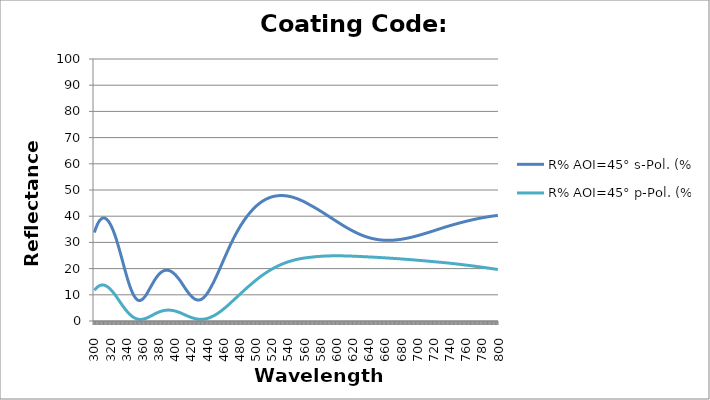
| Category | R% AOI=45° s-Pol. (%) | R% AOI=45° p-Pol. (%) |
|---|---|---|
| 300.0 | 33.782 | 11.718 |
| 301.0 | 34.743 | 12.104 |
| 302.0 | 35.607 | 12.45 |
| 303.0 | 36.377 | 12.756 |
| 304.0 | 37.053 | 13.021 |
| 305.0 | 37.637 | 13.246 |
| 306.0 | 38.132 | 13.429 |
| 307.0 | 38.538 | 13.571 |
| 308.0 | 38.86 | 13.672 |
| 309.0 | 39.097 | 13.734 |
| 310.0 | 39.253 | 13.756 |
| 311.0 | 39.33 | 13.739 |
| 312.0 | 39.328 | 13.684 |
| 313.0 | 39.251 | 13.594 |
| 314.0 | 39.1 | 13.468 |
| 315.0 | 38.878 | 13.308 |
| 316.0 | 38.584 | 13.115 |
| 317.0 | 38.222 | 12.892 |
| 318.0 | 37.794 | 12.639 |
| 319.0 | 37.3 | 12.359 |
| 320.0 | 36.743 | 12.053 |
| 321.0 | 36.124 | 11.723 |
| 322.0 | 35.445 | 11.371 |
| 323.0 | 34.71 | 10.999 |
| 324.0 | 33.921 | 10.61 |
| 325.0 | 33.08 | 10.205 |
| 326.0 | 32.19 | 9.787 |
| 327.0 | 31.256 | 9.358 |
| 328.0 | 30.279 | 8.92 |
| 329.0 | 29.265 | 8.475 |
| 330.0 | 28.217 | 8.026 |
| 331.0 | 27.139 | 7.574 |
| 332.0 | 26.038 | 7.123 |
| 333.0 | 24.918 | 6.674 |
| 334.0 | 23.785 | 6.23 |
| 335.0 | 22.644 | 5.792 |
| 336.0 | 21.503 | 5.363 |
| 337.0 | 20.368 | 4.945 |
| 338.0 | 19.246 | 4.538 |
| 339.0 | 18.144 | 4.146 |
| 340.0 | 17.068 | 3.77 |
| 341.0 | 16.026 | 3.411 |
| 342.0 | 15.025 | 3.07 |
| 343.0 | 14.07 | 2.749 |
| 344.0 | 13.17 | 2.449 |
| 345.0 | 12.328 | 2.171 |
| 346.0 | 11.551 | 1.915 |
| 347.0 | 10.843 | 1.682 |
| 348.0 | 10.208 | 1.472 |
| 349.0 | 9.649 | 1.286 |
| 350.0 | 9.169 | 1.124 |
| 351.0 | 8.722 | 0.976 |
| 352.0 | 8.354 | 0.85 |
| 353.0 | 8.08 | 0.752 |
| 354.0 | 7.897 | 0.678 |
| 355.0 | 7.801 | 0.628 |
| 356.0 | 7.789 | 0.602 |
| 357.0 | 7.855 | 0.597 |
| 358.0 | 7.993 | 0.612 |
| 359.0 | 8.196 | 0.646 |
| 360.0 | 8.456 | 0.697 |
| 361.0 | 8.768 | 0.763 |
| 362.0 | 9.122 | 0.843 |
| 363.0 | 9.512 | 0.935 |
| 364.0 | 9.929 | 1.036 |
| 365.0 | 10.442 | 1.165 |
| 366.0 | 10.996 | 1.309 |
| 367.0 | 11.559 | 1.459 |
| 368.0 | 12.124 | 1.614 |
| 369.0 | 12.68 | 1.772 |
| 370.0 | 13.222 | 1.928 |
| 371.0 | 13.742 | 2.083 |
| 372.0 | 14.291 | 2.249 |
| 373.0 | 14.829 | 2.414 |
| 374.0 | 15.346 | 2.578 |
| 375.0 | 15.84 | 2.737 |
| 376.0 | 16.307 | 2.892 |
| 377.0 | 16.745 | 3.04 |
| 378.0 | 17.153 | 3.182 |
| 379.0 | 17.53 | 3.316 |
| 380.0 | 17.873 | 3.442 |
| 381.0 | 18.183 | 3.558 |
| 382.0 | 18.459 | 3.666 |
| 383.0 | 18.699 | 3.763 |
| 384.0 | 18.904 | 3.85 |
| 385.0 | 19.074 | 3.927 |
| 386.0 | 19.212 | 3.994 |
| 387.0 | 19.315 | 4.05 |
| 388.0 | 19.382 | 4.095 |
| 389.0 | 19.414 | 4.129 |
| 390.0 | 19.411 | 4.151 |
| 391.0 | 19.373 | 4.162 |
| 392.0 | 19.301 | 4.161 |
| 393.0 | 19.197 | 4.149 |
| 394.0 | 19.06 | 4.127 |
| 395.0 | 18.894 | 4.094 |
| 396.0 | 18.697 | 4.051 |
| 397.0 | 18.472 | 3.998 |
| 398.0 | 18.221 | 3.936 |
| 399.0 | 17.944 | 3.865 |
| 400.0 | 17.643 | 3.786 |
| 401.0 | 17.318 | 3.698 |
| 402.0 | 16.974 | 3.603 |
| 403.0 | 16.61 | 3.502 |
| 404.0 | 16.23 | 3.395 |
| 405.0 | 15.835 | 3.282 |
| 406.0 | 15.427 | 3.165 |
| 407.0 | 14.995 | 3.039 |
| 408.0 | 14.508 | 2.896 |
| 409.0 | 14.019 | 2.752 |
| 410.0 | 13.551 | 2.614 |
| 411.0 | 13.084 | 2.475 |
| 412.0 | 12.623 | 2.336 |
| 413.0 | 12.168 | 2.199 |
| 414.0 | 11.724 | 2.064 |
| 415.0 | 11.293 | 1.931 |
| 416.0 | 10.877 | 1.801 |
| 417.0 | 10.48 | 1.676 |
| 418.0 | 10.103 | 1.554 |
| 419.0 | 9.75 | 1.438 |
| 420.0 | 9.423 | 1.328 |
| 421.0 | 9.124 | 1.223 |
| 422.0 | 8.855 | 1.126 |
| 423.0 | 8.62 | 1.036 |
| 424.0 | 8.419 | 0.954 |
| 425.0 | 8.255 | 0.88 |
| 426.0 | 8.129 | 0.816 |
| 427.0 | 8.042 | 0.76 |
| 428.0 | 7.996 | 0.714 |
| 429.0 | 7.992 | 0.678 |
| 430.0 | 8.03 | 0.653 |
| 431.0 | 8.112 | 0.638 |
| 432.0 | 8.236 | 0.634 |
| 433.0 | 8.403 | 0.641 |
| 434.0 | 8.613 | 0.66 |
| 435.0 | 8.865 | 0.689 |
| 436.0 | 9.159 | 0.731 |
| 437.0 | 9.493 | 0.783 |
| 438.0 | 9.867 | 0.848 |
| 439.0 | 10.276 | 0.924 |
| 440.0 | 10.72 | 1.011 |
| 441.0 | 11.199 | 1.109 |
| 442.0 | 11.71 | 1.218 |
| 443.0 | 12.252 | 1.339 |
| 444.0 | 12.822 | 1.471 |
| 445.0 | 13.391 | 1.607 |
| 446.0 | 13.972 | 1.751 |
| 447.0 | 14.573 | 1.904 |
| 448.0 | 15.191 | 2.065 |
| 449.0 | 15.826 | 2.236 |
| 450.0 | 16.476 | 2.415 |
| 451.0 | 17.138 | 2.603 |
| 452.0 | 17.812 | 2.798 |
| 453.0 | 18.496 | 3.002 |
| 454.0 | 19.186 | 3.213 |
| 455.0 | 19.884 | 3.431 |
| 456.0 | 20.585 | 3.656 |
| 457.0 | 21.29 | 3.887 |
| 458.0 | 21.996 | 4.125 |
| 459.0 | 22.703 | 4.368 |
| 460.0 | 23.409 | 4.618 |
| 461.0 | 24.113 | 4.872 |
| 462.0 | 24.814 | 5.131 |
| 463.0 | 25.51 | 5.395 |
| 464.0 | 26.201 | 5.662 |
| 465.0 | 26.886 | 5.934 |
| 466.0 | 27.564 | 6.209 |
| 467.0 | 28.235 | 6.488 |
| 468.0 | 28.896 | 6.769 |
| 469.0 | 29.549 | 7.053 |
| 470.0 | 30.192 | 7.339 |
| 471.0 | 30.825 | 7.626 |
| 472.0 | 31.447 | 7.916 |
| 473.0 | 32.056 | 8.205 |
| 474.0 | 32.643 | 8.49 |
| 475.0 | 33.218 | 8.776 |
| 476.0 | 33.783 | 9.063 |
| 477.0 | 34.336 | 9.35 |
| 478.0 | 34.877 | 9.636 |
| 479.0 | 35.407 | 9.923 |
| 480.0 | 35.924 | 10.21 |
| 481.0 | 36.43 | 10.495 |
| 482.0 | 36.923 | 10.78 |
| 483.0 | 37.404 | 11.064 |
| 484.0 | 37.874 | 11.347 |
| 485.0 | 38.33 | 11.628 |
| 486.0 | 38.775 | 11.908 |
| 487.0 | 39.208 | 12.186 |
| 488.0 | 39.628 | 12.462 |
| 489.0 | 40.036 | 12.736 |
| 490.0 | 40.433 | 13.008 |
| 491.0 | 40.817 | 13.278 |
| 492.0 | 41.19 | 13.545 |
| 493.0 | 41.55 | 13.81 |
| 494.0 | 41.9 | 14.072 |
| 495.0 | 42.242 | 14.335 |
| 496.0 | 42.578 | 14.599 |
| 497.0 | 42.902 | 14.859 |
| 498.0 | 43.215 | 15.117 |
| 499.0 | 43.515 | 15.371 |
| 500.0 | 43.805 | 15.622 |
| 501.0 | 44.082 | 15.87 |
| 502.0 | 44.349 | 16.114 |
| 503.0 | 44.605 | 16.355 |
| 504.0 | 44.85 | 16.592 |
| 505.0 | 45.084 | 16.825 |
| 506.0 | 45.308 | 17.055 |
| 507.0 | 45.521 | 17.281 |
| 508.0 | 45.724 | 17.503 |
| 509.0 | 45.917 | 17.722 |
| 510.0 | 46.1 | 17.936 |
| 511.0 | 46.273 | 18.147 |
| 512.0 | 46.436 | 18.354 |
| 513.0 | 46.59 | 18.558 |
| 514.0 | 46.735 | 18.757 |
| 515.0 | 46.871 | 18.953 |
| 516.0 | 46.997 | 19.144 |
| 517.0 | 47.114 | 19.332 |
| 518.0 | 47.222 | 19.516 |
| 519.0 | 47.322 | 19.696 |
| 520.0 | 47.413 | 19.871 |
| 521.0 | 47.495 | 20.044 |
| 522.0 | 47.569 | 20.212 |
| 523.0 | 47.635 | 20.376 |
| 524.0 | 47.694 | 20.537 |
| 525.0 | 47.744 | 20.693 |
| 526.0 | 47.786 | 20.846 |
| 527.0 | 47.821 | 20.996 |
| 528.0 | 47.848 | 21.141 |
| 529.0 | 47.868 | 21.283 |
| 530.0 | 47.88 | 21.421 |
| 531.0 | 47.886 | 21.556 |
| 532.0 | 47.884 | 21.687 |
| 533.0 | 47.875 | 21.814 |
| 534.0 | 47.86 | 21.938 |
| 535.0 | 47.838 | 22.059 |
| 536.0 | 47.809 | 22.176 |
| 537.0 | 47.774 | 22.289 |
| 538.0 | 47.732 | 22.4 |
| 539.0 | 47.685 | 22.506 |
| 540.0 | 47.631 | 22.61 |
| 541.0 | 47.571 | 22.711 |
| 542.0 | 47.505 | 22.808 |
| 543.0 | 47.433 | 22.902 |
| 544.0 | 47.356 | 22.993 |
| 545.0 | 47.272 | 23.081 |
| 546.0 | 47.184 | 23.166 |
| 547.0 | 47.09 | 23.248 |
| 548.0 | 46.99 | 23.327 |
| 549.0 | 46.886 | 23.404 |
| 550.0 | 46.776 | 23.477 |
| 551.0 | 46.661 | 23.547 |
| 552.0 | 46.541 | 23.615 |
| 553.0 | 46.416 | 23.68 |
| 554.0 | 46.286 | 23.742 |
| 555.0 | 46.152 | 23.801 |
| 556.0 | 46.013 | 23.856 |
| 557.0 | 45.87 | 23.909 |
| 558.0 | 45.723 | 23.96 |
| 559.0 | 45.571 | 24.008 |
| 560.0 | 45.416 | 24.053 |
| 561.0 | 45.256 | 24.097 |
| 562.0 | 45.093 | 24.138 |
| 563.0 | 44.926 | 24.177 |
| 564.0 | 44.755 | 24.213 |
| 565.0 | 44.58 | 24.248 |
| 566.0 | 44.402 | 24.28 |
| 567.0 | 44.229 | 24.315 |
| 568.0 | 44.063 | 24.354 |
| 569.0 | 43.895 | 24.391 |
| 570.0 | 43.724 | 24.427 |
| 571.0 | 43.551 | 24.461 |
| 572.0 | 43.375 | 24.494 |
| 573.0 | 43.197 | 24.524 |
| 574.0 | 43.017 | 24.554 |
| 575.0 | 42.835 | 24.582 |
| 576.0 | 42.651 | 24.608 |
| 577.0 | 42.465 | 24.633 |
| 578.0 | 42.277 | 24.657 |
| 579.0 | 42.088 | 24.679 |
| 580.0 | 41.897 | 24.7 |
| 581.0 | 41.705 | 24.72 |
| 582.0 | 41.511 | 24.738 |
| 583.0 | 41.316 | 24.755 |
| 584.0 | 41.12 | 24.771 |
| 585.0 | 40.924 | 24.785 |
| 586.0 | 40.726 | 24.799 |
| 587.0 | 40.528 | 24.811 |
| 588.0 | 40.329 | 24.823 |
| 589.0 | 40.13 | 24.833 |
| 590.0 | 39.93 | 24.842 |
| 591.0 | 39.73 | 24.85 |
| 592.0 | 39.529 | 24.857 |
| 593.0 | 39.329 | 24.864 |
| 594.0 | 39.129 | 24.869 |
| 595.0 | 38.929 | 24.873 |
| 596.0 | 38.729 | 24.876 |
| 597.0 | 38.53 | 24.879 |
| 598.0 | 38.331 | 24.881 |
| 599.0 | 38.132 | 24.882 |
| 600.0 | 37.935 | 24.882 |
| 601.0 | 37.738 | 24.881 |
| 602.0 | 37.542 | 24.88 |
| 603.0 | 37.347 | 24.877 |
| 604.0 | 37.154 | 24.874 |
| 605.0 | 36.962 | 24.871 |
| 606.0 | 36.771 | 24.866 |
| 607.0 | 36.581 | 24.861 |
| 608.0 | 36.393 | 24.856 |
| 609.0 | 36.207 | 24.849 |
| 610.0 | 36.023 | 24.842 |
| 611.0 | 35.841 | 24.835 |
| 612.0 | 35.66 | 24.827 |
| 613.0 | 35.482 | 24.819 |
| 614.0 | 35.306 | 24.81 |
| 615.0 | 35.133 | 24.8 |
| 616.0 | 34.961 | 24.79 |
| 617.0 | 34.793 | 24.779 |
| 618.0 | 34.626 | 24.768 |
| 619.0 | 34.463 | 24.757 |
| 620.0 | 34.302 | 24.745 |
| 621.0 | 34.144 | 24.732 |
| 622.0 | 33.989 | 24.72 |
| 623.0 | 33.837 | 24.706 |
| 624.0 | 33.688 | 24.693 |
| 625.0 | 33.542 | 24.679 |
| 626.0 | 33.399 | 24.665 |
| 627.0 | 33.259 | 24.65 |
| 628.0 | 33.123 | 24.635 |
| 629.0 | 32.99 | 24.62 |
| 630.0 | 32.86 | 24.604 |
| 631.0 | 32.734 | 24.588 |
| 632.0 | 32.612 | 24.572 |
| 633.0 | 32.494 | 24.556 |
| 634.0 | 32.381 | 24.541 |
| 635.0 | 32.273 | 24.526 |
| 636.0 | 32.169 | 24.512 |
| 637.0 | 32.068 | 24.496 |
| 638.0 | 31.972 | 24.481 |
| 639.0 | 31.879 | 24.466 |
| 640.0 | 31.79 | 24.45 |
| 641.0 | 31.704 | 24.434 |
| 642.0 | 31.623 | 24.418 |
| 643.0 | 31.545 | 24.402 |
| 644.0 | 31.472 | 24.385 |
| 645.0 | 31.402 | 24.368 |
| 646.0 | 31.336 | 24.352 |
| 647.0 | 31.274 | 24.334 |
| 648.0 | 31.215 | 24.317 |
| 649.0 | 31.161 | 24.3 |
| 650.0 | 31.11 | 24.282 |
| 651.0 | 31.063 | 24.264 |
| 652.0 | 31.02 | 24.246 |
| 653.0 | 30.98 | 24.228 |
| 654.0 | 30.945 | 24.209 |
| 655.0 | 30.913 | 24.19 |
| 656.0 | 30.885 | 24.172 |
| 657.0 | 30.86 | 24.153 |
| 658.0 | 30.839 | 24.133 |
| 659.0 | 30.822 | 24.114 |
| 660.0 | 30.808 | 24.095 |
| 661.0 | 30.798 | 24.075 |
| 662.0 | 30.792 | 24.055 |
| 663.0 | 30.788 | 24.035 |
| 664.0 | 30.788 | 24.015 |
| 665.0 | 30.792 | 23.995 |
| 666.0 | 30.799 | 23.975 |
| 667.0 | 30.809 | 23.954 |
| 668.0 | 30.823 | 23.934 |
| 669.0 | 30.839 | 23.913 |
| 670.0 | 30.859 | 23.892 |
| 671.0 | 30.882 | 23.871 |
| 672.0 | 30.908 | 23.849 |
| 673.0 | 30.936 | 23.828 |
| 674.0 | 30.968 | 23.806 |
| 675.0 | 31.002 | 23.785 |
| 676.0 | 31.04 | 23.763 |
| 677.0 | 31.079 | 23.741 |
| 678.0 | 31.122 | 23.719 |
| 679.0 | 31.167 | 23.696 |
| 680.0 | 31.215 | 23.674 |
| 681.0 | 31.265 | 23.651 |
| 682.0 | 31.317 | 23.628 |
| 683.0 | 31.372 | 23.606 |
| 684.0 | 31.429 | 23.582 |
| 685.0 | 31.488 | 23.559 |
| 686.0 | 31.55 | 23.536 |
| 687.0 | 31.613 | 23.512 |
| 688.0 | 31.679 | 23.488 |
| 689.0 | 31.746 | 23.464 |
| 690.0 | 31.815 | 23.44 |
| 691.0 | 31.886 | 23.416 |
| 692.0 | 31.959 | 23.392 |
| 693.0 | 32.034 | 23.367 |
| 694.0 | 32.11 | 23.342 |
| 695.0 | 32.187 | 23.318 |
| 696.0 | 32.266 | 23.292 |
| 697.0 | 32.347 | 23.267 |
| 698.0 | 32.429 | 23.242 |
| 699.0 | 32.512 | 23.216 |
| 700.0 | 32.596 | 23.19 |
| 701.0 | 32.682 | 23.164 |
| 702.0 | 32.768 | 23.138 |
| 703.0 | 32.856 | 23.112 |
| 704.0 | 32.944 | 23.085 |
| 705.0 | 33.034 | 23.058 |
| 706.0 | 33.124 | 23.031 |
| 707.0 | 33.216 | 23.004 |
| 708.0 | 33.308 | 22.976 |
| 709.0 | 33.4 | 22.949 |
| 710.0 | 33.494 | 22.921 |
| 711.0 | 33.588 | 22.893 |
| 712.0 | 33.682 | 22.865 |
| 713.0 | 33.777 | 22.836 |
| 714.0 | 33.873 | 22.808 |
| 715.0 | 33.969 | 22.779 |
| 716.0 | 34.065 | 22.75 |
| 717.0 | 34.162 | 22.721 |
| 718.0 | 34.258 | 22.691 |
| 719.0 | 34.356 | 22.662 |
| 720.0 | 34.456 | 22.634 |
| 721.0 | 34.556 | 22.608 |
| 722.0 | 34.658 | 22.581 |
| 723.0 | 34.759 | 22.554 |
| 724.0 | 34.86 | 22.527 |
| 725.0 | 34.961 | 22.499 |
| 726.0 | 35.062 | 22.472 |
| 727.0 | 35.162 | 22.444 |
| 728.0 | 35.263 | 22.416 |
| 729.0 | 35.363 | 22.387 |
| 730.0 | 35.464 | 22.359 |
| 731.0 | 35.563 | 22.33 |
| 732.0 | 35.663 | 22.301 |
| 733.0 | 35.762 | 22.271 |
| 734.0 | 35.859 | 22.241 |
| 735.0 | 35.951 | 22.209 |
| 736.0 | 36.043 | 22.176 |
| 737.0 | 36.134 | 22.143 |
| 738.0 | 36.225 | 22.11 |
| 739.0 | 36.315 | 22.077 |
| 740.0 | 36.405 | 22.044 |
| 741.0 | 36.494 | 22.01 |
| 742.0 | 36.583 | 21.976 |
| 743.0 | 36.671 | 21.942 |
| 744.0 | 36.759 | 21.907 |
| 745.0 | 36.846 | 21.873 |
| 746.0 | 36.932 | 21.838 |
| 747.0 | 37.018 | 21.803 |
| 748.0 | 37.104 | 21.767 |
| 749.0 | 37.188 | 21.732 |
| 750.0 | 37.272 | 21.696 |
| 751.0 | 37.356 | 21.66 |
| 752.0 | 37.438 | 21.624 |
| 753.0 | 37.52 | 21.587 |
| 754.0 | 37.601 | 21.551 |
| 755.0 | 37.681 | 21.514 |
| 756.0 | 37.76 | 21.476 |
| 757.0 | 37.839 | 21.439 |
| 758.0 | 37.917 | 21.401 |
| 759.0 | 37.994 | 21.363 |
| 760.0 | 38.07 | 21.325 |
| 761.0 | 38.146 | 21.287 |
| 762.0 | 38.22 | 21.248 |
| 763.0 | 38.294 | 21.209 |
| 764.0 | 38.367 | 21.17 |
| 765.0 | 38.439 | 21.131 |
| 766.0 | 38.51 | 21.092 |
| 767.0 | 38.58 | 21.052 |
| 768.0 | 38.65 | 21.012 |
| 769.0 | 38.718 | 20.972 |
| 770.0 | 38.785 | 20.931 |
| 771.0 | 38.852 | 20.89 |
| 772.0 | 38.917 | 20.849 |
| 773.0 | 38.982 | 20.808 |
| 774.0 | 39.046 | 20.767 |
| 775.0 | 39.108 | 20.725 |
| 776.0 | 39.17 | 20.683 |
| 777.0 | 39.231 | 20.641 |
| 778.0 | 39.29 | 20.599 |
| 779.0 | 39.349 | 20.556 |
| 780.0 | 39.407 | 20.513 |
| 781.0 | 39.464 | 20.47 |
| 782.0 | 39.52 | 20.427 |
| 783.0 | 39.575 | 20.383 |
| 784.0 | 39.628 | 20.34 |
| 785.0 | 39.681 | 20.296 |
| 786.0 | 39.733 | 20.252 |
| 787.0 | 39.784 | 20.207 |
| 788.0 | 39.834 | 20.162 |
| 789.0 | 39.882 | 20.118 |
| 790.0 | 39.93 | 20.072 |
| 791.0 | 39.977 | 20.027 |
| 792.0 | 40.022 | 19.982 |
| 793.0 | 40.067 | 19.936 |
| 794.0 | 40.111 | 19.89 |
| 795.0 | 40.154 | 19.844 |
| 796.0 | 40.195 | 19.797 |
| 797.0 | 40.236 | 19.751 |
| 798.0 | 40.275 | 19.704 |
| 799.0 | 40.314 | 19.657 |
| 800.0 | 40.351 | 19.609 |